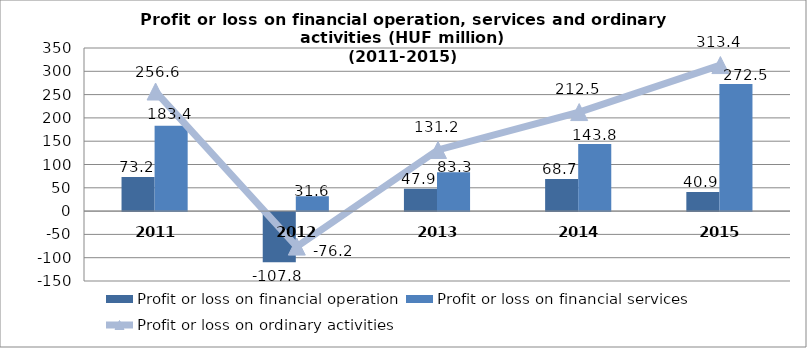
| Category | Profit or loss on financial operation | Profit or loss on financial services |
|---|---|---|
| 2011.0 | 73.2 | 183.4 |
| 2012.0 | -107.8 | 31.6 |
| 2013.0 | 47.9 | 83.3 |
| 2014.0 | 68.7 | 143.8 |
| 2015.0 | 40.852 | 272.524 |